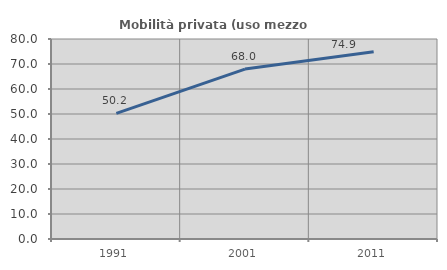
| Category | Mobilità privata (uso mezzo privato) |
|---|---|
| 1991.0 | 50.232 |
| 2001.0 | 67.967 |
| 2011.0 | 74.857 |